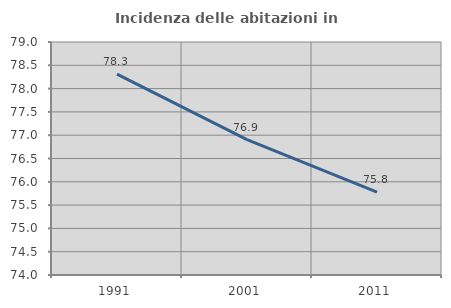
| Category | Incidenza delle abitazioni in proprietà  |
|---|---|
| 1991.0 | 78.31 |
| 2001.0 | 76.906 |
| 2011.0 | 75.78 |